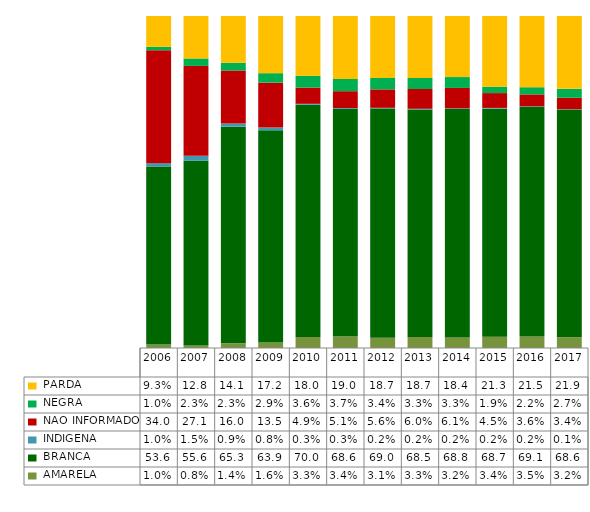
| Category |  AMARELA     |  BRANCA      |  INDIGENA    |  NAO INFORMADO  |  NEGRA       |  PARDA       |
|---|---|---|---|---|---|---|
| 2006.0 | 0.01 | 0.536 | 0.01 | 0.34 | 0.01 | 0.093 |
| 2007.0 | 0.008 | 0.556 | 0.015 | 0.271 | 0.023 | 0.128 |
| 2008.0 | 0.014 | 0.653 | 0.009 | 0.16 | 0.023 | 0.141 |
| 2009.0 | 0.016 | 0.639 | 0.008 | 0.135 | 0.029 | 0.172 |
| 2010.0 | 0.033 | 0.7 | 0.003 | 0.049 | 0.036 | 0.18 |
| 2011.0 | 0.034 | 0.686 | 0.003 | 0.051 | 0.037 | 0.19 |
| 2012.0 | 0.031 | 0.69 | 0.002 | 0.056 | 0.034 | 0.187 |
| 2013.0 | 0.033 | 0.685 | 0.002 | 0.06 | 0.033 | 0.187 |
| 2014.0 | 0.032 | 0.688 | 0.002 | 0.061 | 0.033 | 0.184 |
| 2015.0 | 0.034 | 0.687 | 0.002 | 0.045 | 0.019 | 0.213 |
| 2016.0 | 0.035 | 0.691 | 0.002 | 0.036 | 0.022 | 0.215 |
| 2017.0 | 0.032 | 0.686 | 0.001 | 0.034 | 0.027 | 0.219 |